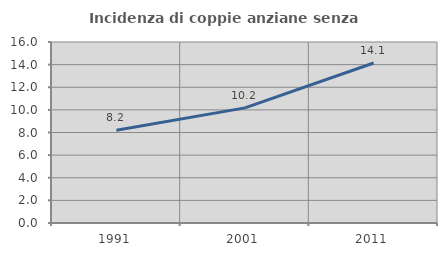
| Category | Incidenza di coppie anziane senza figli  |
|---|---|
| 1991.0 | 8.195 |
| 2001.0 | 10.177 |
| 2011.0 | 14.146 |